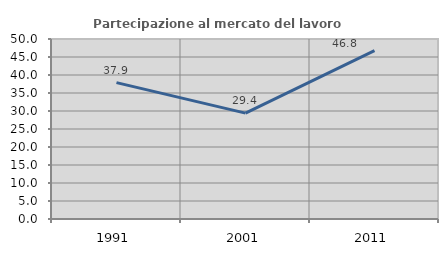
| Category | Partecipazione al mercato del lavoro  femminile |
|---|---|
| 1991.0 | 37.879 |
| 2001.0 | 29.412 |
| 2011.0 | 46.774 |